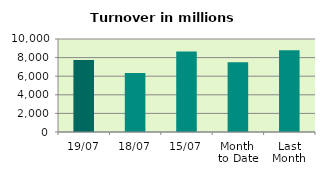
| Category | Series 0 |
|---|---|
| 19/07 | 7739.632 |
| 18/07 | 6354.427 |
| 15/07 | 8659.06 |
| Month 
to Date | 7512.241 |
| Last
Month | 8790.45 |